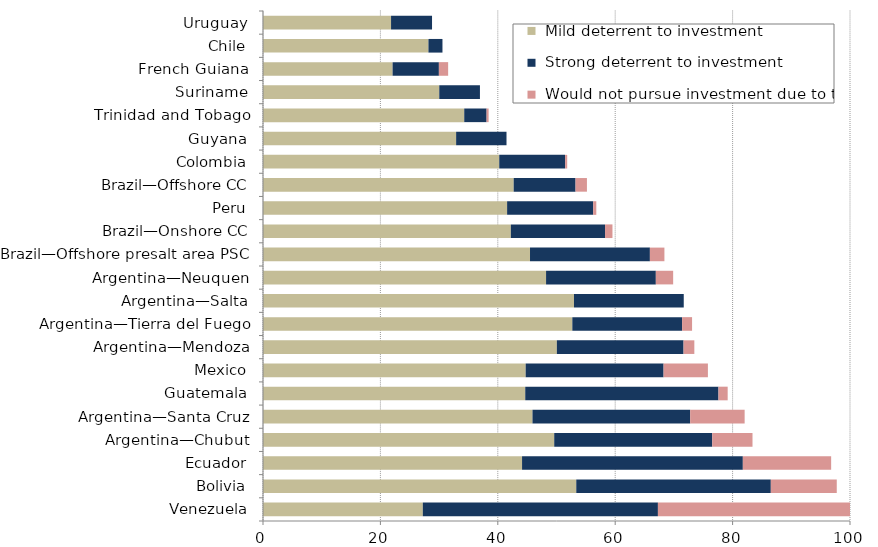
| Category |  Mild deterrent to investment |  Strong deterrent to investment |  Would not pursue investment due to this factor |
|---|---|---|---|
| Venezuela | 27.225 | 40.052 | 32.723 |
| Bolivia | 53.367 | 33.144 | 11.235 |
| Ecuador | 44.132 | 37.612 | 15.045 |
| Argentina—Chubut | 49.612 | 26.917 | 6.861 |
| Argentina—Santa Cruz | 45.909 | 26.862 | 9.28 |
| Guatemala | 44.675 | 32.918 | 1.568 |
| Mexico | 44.749 | 23.493 | 7.551 |
| Argentina—Mendoza | 50.06 | 21.585 | 1.837 |
| Argentina—Tierra del Fuego | 52.696 | 18.699 | 1.7 |
| Argentina—Salta | 52.979 | 18.699 | 0 |
| Argentina—Neuquen | 48.223 | 18.699 | 2.952 |
| Brazil—Offshore presalt area PSC | 45.487 | 20.423 | 2.475 |
| Brazil—Onshore CC | 42.223 | 16.045 | 1.267 |
| Peru | 41.586 | 14.662 | 0.533 |
| Brazil—Offshore CC | 42.706 | 10.538 | 1.941 |
| Colombia | 40.246 | 11.219 | 0.356 |
| Guyana | 32.901 | 8.583 | 0 |
| Trinidad and Tobago | 34.281 | 3.809 | 0.346 |
| Suriname | 30.028 | 6.929 | 0 |
| French Guiana | 22.078 | 7.885 | 1.577 |
| Chile | 28.184 | 2.389 | 0 |
| Uruguay | 21.815 | 6.981 | 0 |